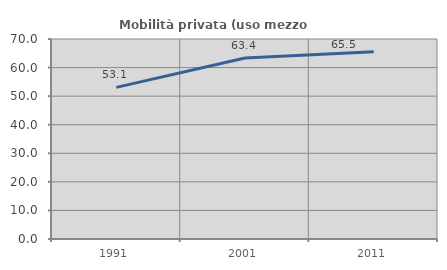
| Category | Mobilità privata (uso mezzo privato) |
|---|---|
| 1991.0 | 53.079 |
| 2001.0 | 63.367 |
| 2011.0 | 65.522 |